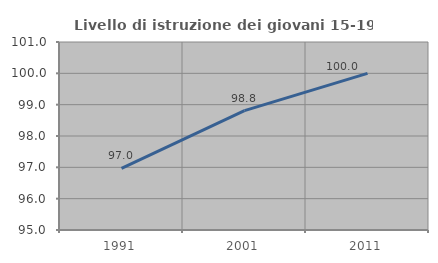
| Category | Livello di istruzione dei giovani 15-19 anni |
|---|---|
| 1991.0 | 96.97 |
| 2001.0 | 98.81 |
| 2011.0 | 100 |